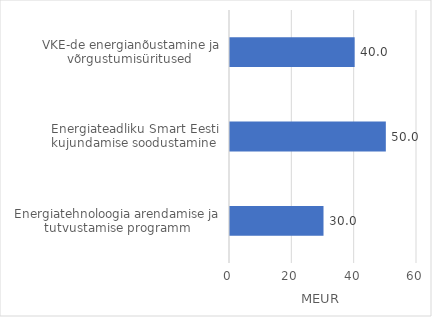
| Category | Series 0 |
|---|---|
| Energiatehnoloogia arendamise ja tutvustamise programm | 30 |
| Energiateadliku Smart Eesti kujundamise soodustamine  | 50 |
| VKE-de energianõustamine ja võrgustumisüritused  | 40 |